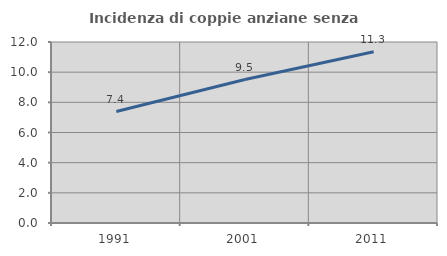
| Category | Incidenza di coppie anziane senza figli  |
|---|---|
| 1991.0 | 7.388 |
| 2001.0 | 9.511 |
| 2011.0 | 11.35 |